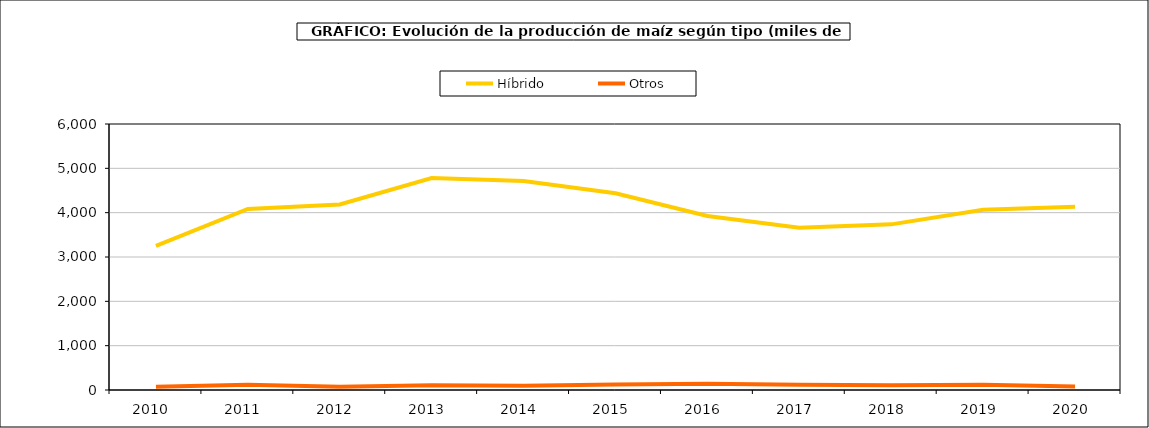
| Category | Híbrido | Otros |
|---|---|---|
| 2010  | 3250.084 | 74.737 |
| 2011  | 4084.167 | 115.76 |
| 2012  | 4186.073 | 75.996 |
| 2013  | 4779.482 | 108.979 |
| 2014  | 4715.168 | 95.477 |
| 2015  | 4439.372 | 125.044 |
| 2016  | 3925.755 | 143.753 |
| 2017  | 3659.487 | 116.158 |
| 2018  | 3736.182 | 106.337 |
| 2019  | 4067.716 | 116.743 |
| 2020  | 4134.991 | 79.111 |